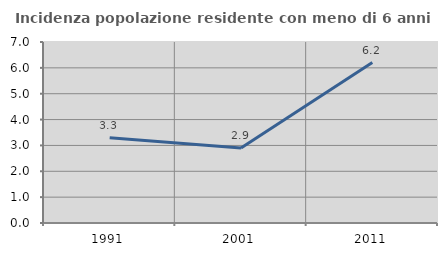
| Category | Incidenza popolazione residente con meno di 6 anni |
|---|---|
| 1991.0 | 3.297 |
| 2001.0 | 2.899 |
| 2011.0 | 6.206 |